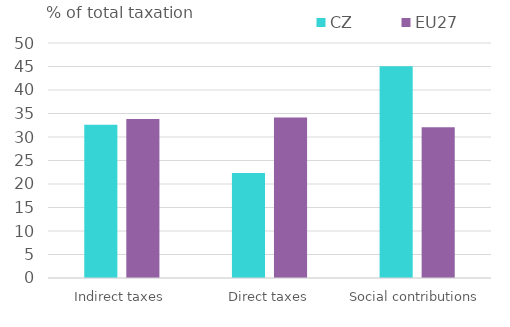
| Category | CZ | EU27 |
|---|---|---|
| Indirect taxes | 32.586 | 33.811 |
| Direct taxes | 22.366 | 34.133 |
| Social contributions | 45.048 | 32.056 |